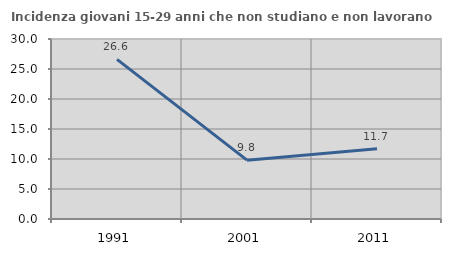
| Category | Incidenza giovani 15-29 anni che non studiano e non lavorano  |
|---|---|
| 1991.0 | 26.596 |
| 2001.0 | 9.804 |
| 2011.0 | 11.698 |